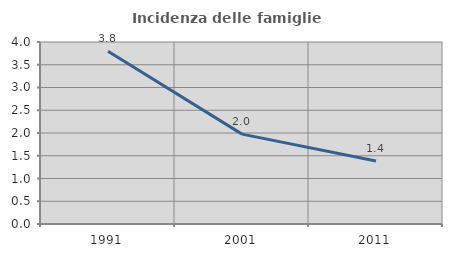
| Category | Incidenza delle famiglie numerose |
|---|---|
| 1991.0 | 3.795 |
| 2001.0 | 1.975 |
| 2011.0 | 1.386 |